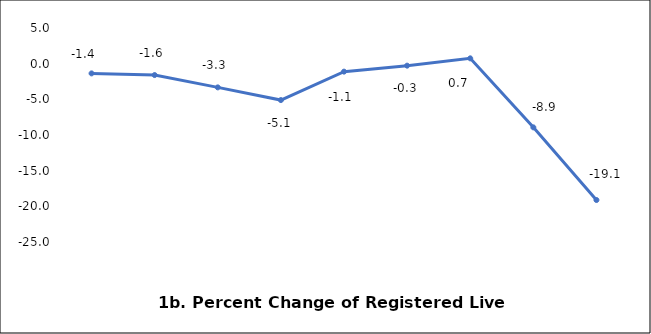
| Category | Series 0 |
|---|---|
| 0 | -1.364 |
| 1 | -1.597 |
| 2 | -3.324 |
| 3 | -5.104 |
| 4 | -1.117 |
| 5 | -0.28 |
| 6 | 0.747 |
| 7 | -8.929 |
| 8 | -19.115 |